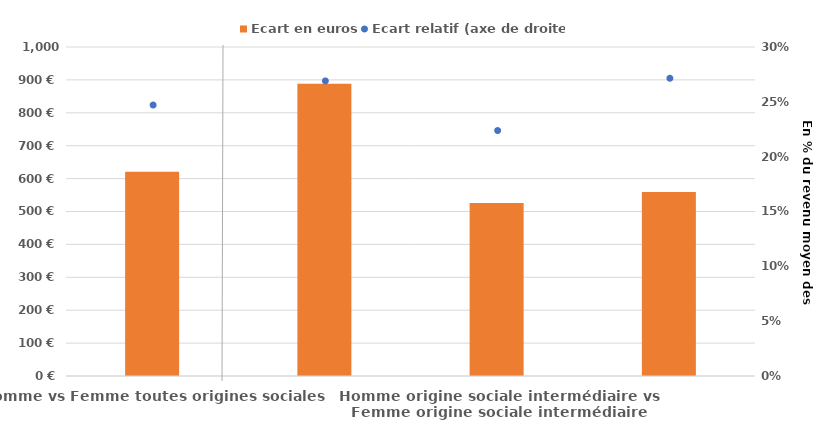
| Category | Ecart en euros |
|---|---|
| Homme vs Femme toutes origines sociales | 620.47 |
| Homme origine sociale favorisée vs Femme origine sociale favorisée | 888 |
| Homme origine sociale intermédiaire vs Femme origine sociale intermédiaire | 526 |
| Homme origine sociale modeste vs Femme origine sociale modeste | 559 |